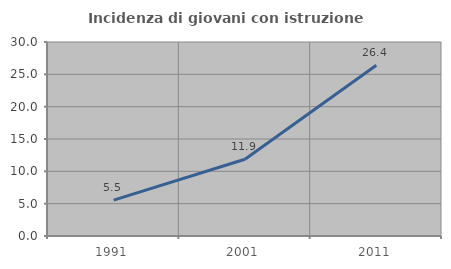
| Category | Incidenza di giovani con istruzione universitaria |
|---|---|
| 1991.0 | 5.543 |
| 2001.0 | 11.876 |
| 2011.0 | 26.397 |